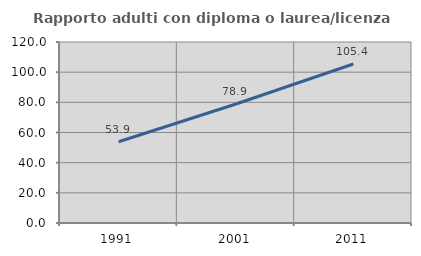
| Category | Rapporto adulti con diploma o laurea/licenza media  |
|---|---|
| 1991.0 | 53.869 |
| 2001.0 | 78.874 |
| 2011.0 | 105.437 |